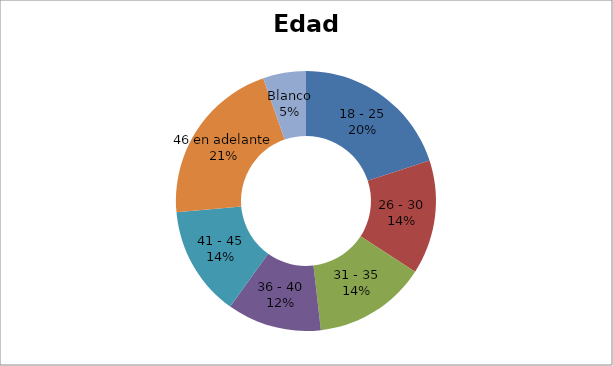
| Category | Series 0 |
|---|---|
| 18 - 25 | 0.2 |
| 26 - 30 | 0.142 |
| 31 - 35 | 0.14 |
| 36 - 40 | 0.117 |
| 41 - 45 | 0.137 |
| 46 en adelante | 0.21 |
| Blanco | 0.053 |